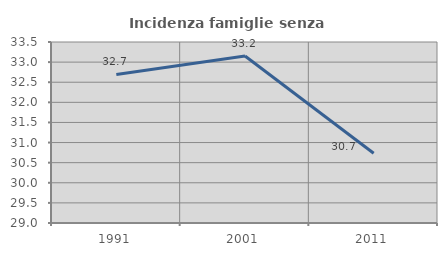
| Category | Incidenza famiglie senza nuclei |
|---|---|
| 1991.0 | 32.692 |
| 2001.0 | 33.154 |
| 2011.0 | 30.735 |